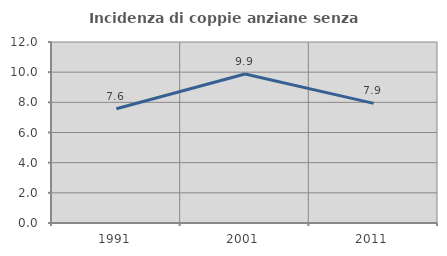
| Category | Incidenza di coppie anziane senza figli  |
|---|---|
| 1991.0 | 7.574 |
| 2001.0 | 9.875 |
| 2011.0 | 7.931 |